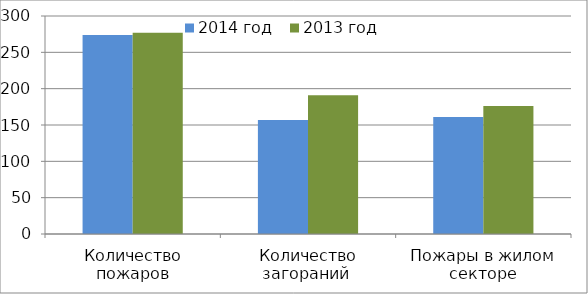
| Category | 2014 год | 2013 год |
|---|---|---|
| Количество пожаров | 274 | 277 |
| Количество загораний  | 157 | 191 |
| Пожары в жилом секторе | 161 | 176 |